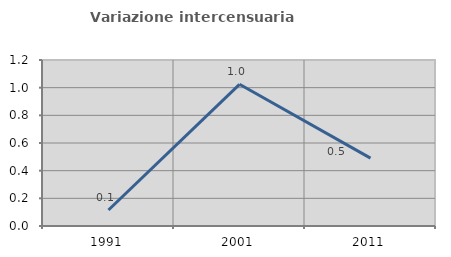
| Category | Variazione intercensuaria annua |
|---|---|
| 1991.0 | 0.116 |
| 2001.0 | 1.024 |
| 2011.0 | 0.491 |